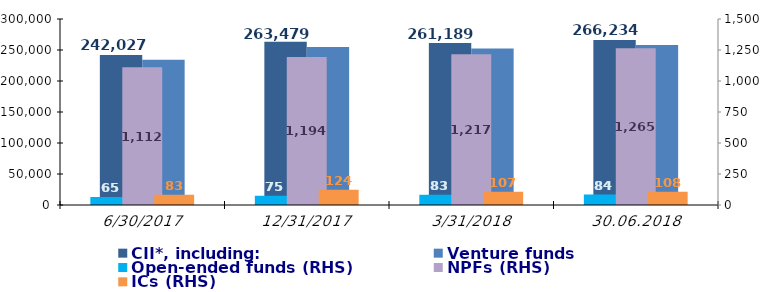
| Category | CII*, including: | Venture funds |
|---|---|---|
| 30.06.2017 | 242027.453 | 234376.575 |
| 31.12.2017 | 263479.382 | 254957.863 |
| 31.03.2018 | 261188.737 | 252508.217 |
| 30.06.2018 | 266234.143 | 257881.459 |